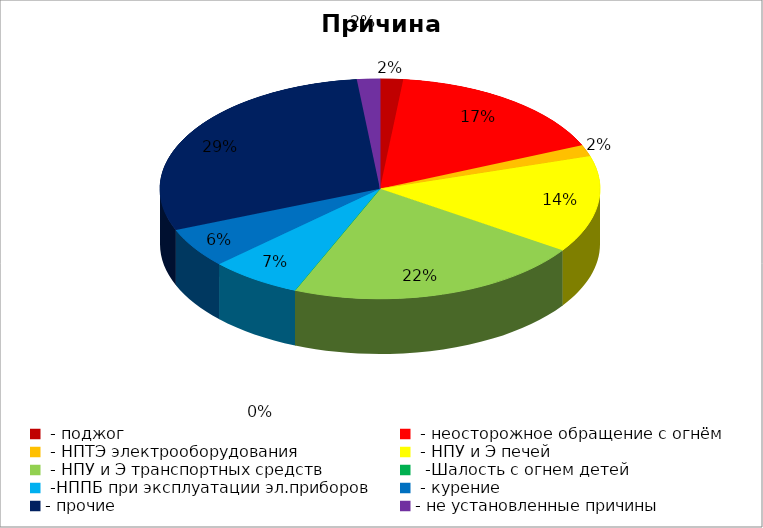
| Category | Причина пожара |
|---|---|
|  - поджог | 2 |
|  - неосторожное обращение с огнём | 20 |
|  - НПТЭ электрооборудования | 2 |
|  - НПУ и Э печей | 17 |
|  - НПУ и Э транспортных средств | 26 |
|   -Шалость с огнем детей | 0 |
|  -НППБ при эксплуатации эл.приборов | 8 |
|  - курение | 7 |
| - прочие | 35 |
| - не установленные причины | 2 |